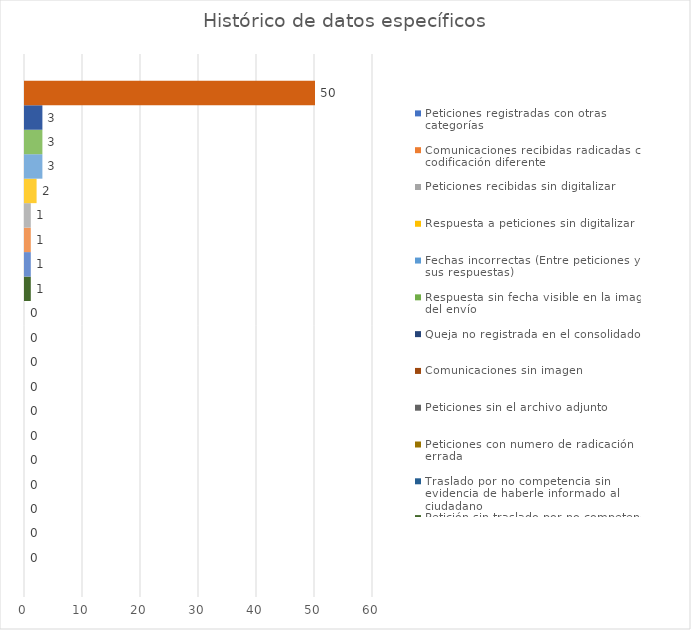
| Category | Peticiones registradas con otras categorías | Comunicaciones recibidas radicadas con codificación diferente | Peticiones recibidas sin digitalizar | Respuesta a peticiones sin digitalizar | Fechas incorrectas (Entre peticiones y sus respuestas) | Respuesta sin fecha visible en la imagen del envío  | Queja no registrada en el consolidado | Comunicaciones sin imagen | Peticiones sin el archivo adjunto | Peticiones con numero de radicación errada | Traslado por no competencia sin evidencia de haberle informado al ciudadano | Petición sin traslado por no competencia | Radicados de respuestas a peticiones repetidos | Respuesta parcial, registrada como definitiva, sin el reinicio del conteo para el  envío de la respuesta definitiva | Respuesta con formato de firma no oficial | Petición registrada con categoria diferente | Comunicaciones recibidas con radicados repetidos  | Peticiones con radicados repetidos | Imagenes con texto incompleto | Peticiones con códigos de radicado de respuesta diferente al normalizado |
|---|---|---|---|---|---|---|---|---|---|---|---|---|---|---|---|---|---|---|---|---|
| CANTIDAD | 0 | 0 | 0 | 0 | 0 | 0 | 0 | 0 | 0 | 0 | 0 | 1 | 1 | 1 | 1 | 2 | 3 | 3 | 3 | 50 |